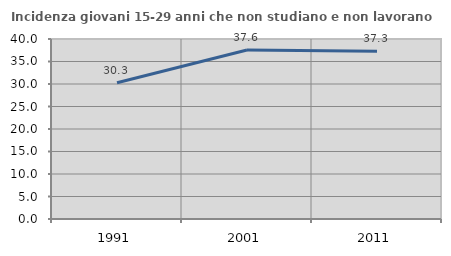
| Category | Incidenza giovani 15-29 anni che non studiano e non lavorano  |
|---|---|
| 1991.0 | 30.288 |
| 2001.0 | 37.561 |
| 2011.0 | 37.294 |